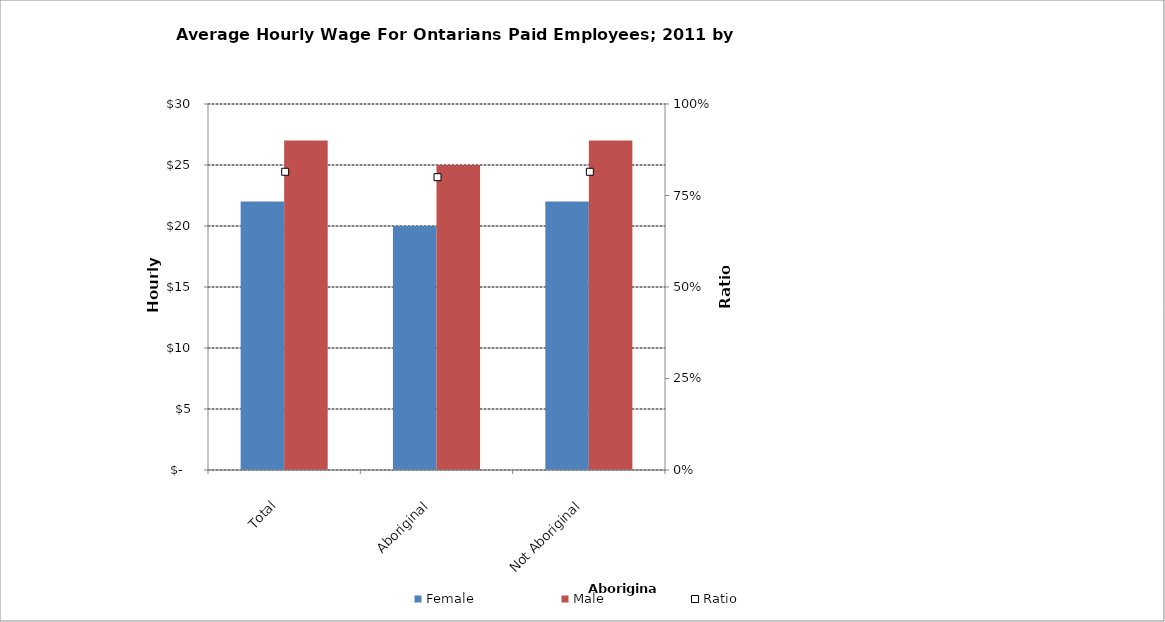
| Category | Female | Male |
|---|---|---|
| Total | 22 | 27 |
|  Aboriginal  | 20 | 25 |
|  Not Aboriginal  | 22 | 27 |